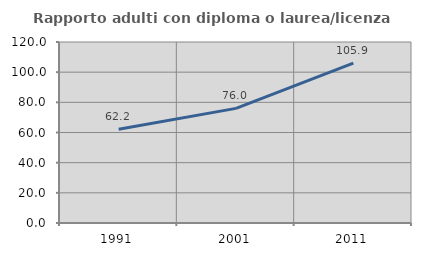
| Category | Rapporto adulti con diploma o laurea/licenza media  |
|---|---|
| 1991.0 | 62.19 |
| 2001.0 | 75.994 |
| 2011.0 | 105.931 |